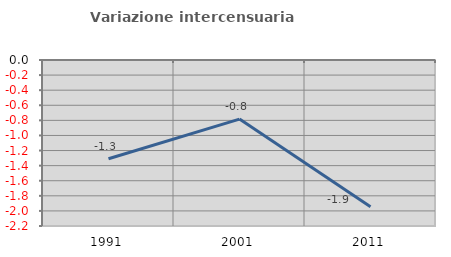
| Category | Variazione intercensuaria annua |
|---|---|
| 1991.0 | -1.309 |
| 2001.0 | -0.783 |
| 2011.0 | -1.946 |